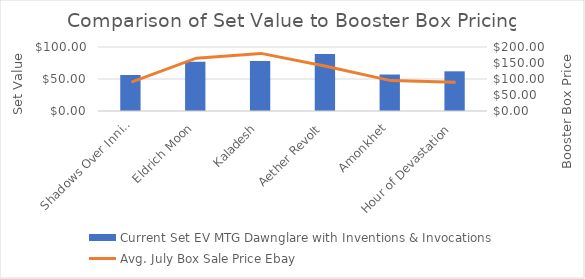
| Category | Current Set EV MTG Dawnglare with Inventions & Invocations |
|---|---|
| Shadows Over Innistrad | 56.24 |
| Eldrich Moon | 76.99 |
| Kaladesh | 78.21 |
| Aether Revolt | 89.11 |
| Amonkhet | 57 |
| Hour of Devastation | 62.01 |